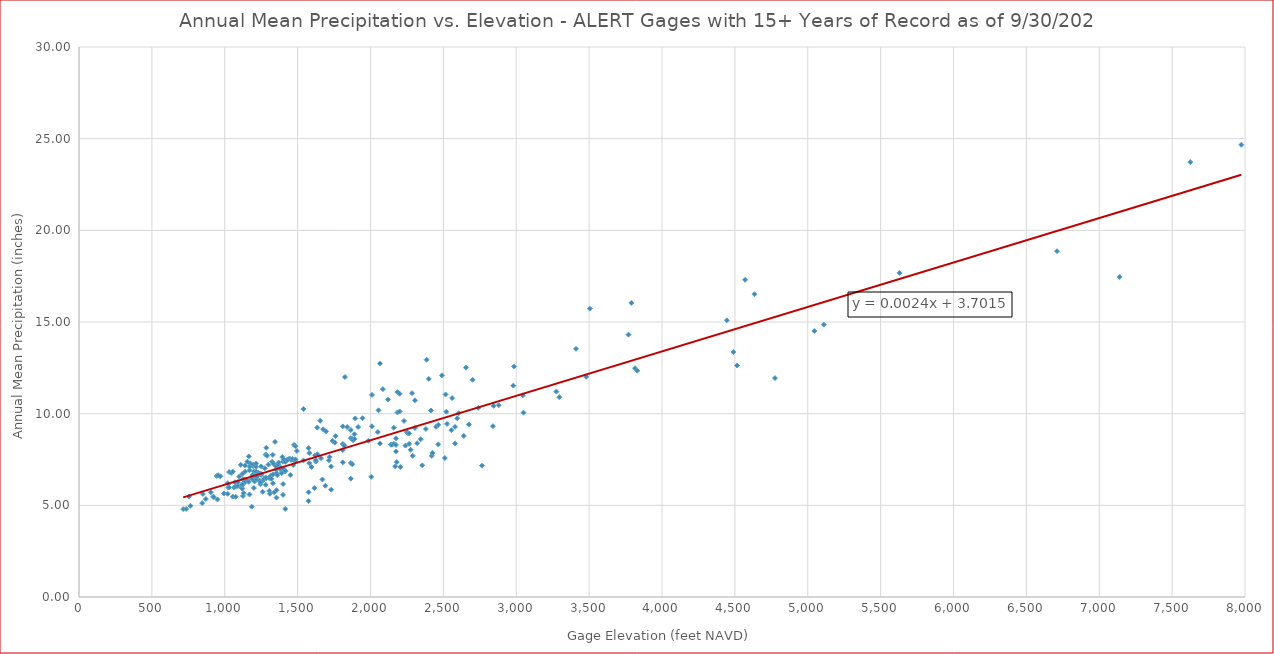
| Category | Series 0 |
|---|---|
| 715.0 | 4.795 |
| 735.0 | 4.805 |
| 755.0 | 5.478 |
| 765.0 | 4.974 |
| 845.0 | 5.12 |
| 850.0 | 5.62 |
| 870.0 | 5.345 |
| 905.0 | 5.713 |
| 920.0 | 5.465 |
| 925.0 | 5.451 |
| 945.0 | 6.602 |
| 950.0 | 5.32 |
| 955.0 | 6.643 |
| 970.0 | 6.581 |
| 995.0 | 5.648 |
| 1020.0 | 5.63 |
| 1020.0 | 6.209 |
| 1025.0 | 5.972 |
| 1025.0 | 6.163 |
| 1030.0 | 5.973 |
| 1030.0 | 6.816 |
| 1045.0 | 6.77 |
| 1055.0 | 5.474 |
| 1055.0 | 6.836 |
| 1065.0 | 5.971 |
| 1070.0 | 6.258 |
| 1075.0 | 5.467 |
| 1075.0 | 6.025 |
| 1090.0 | 6.056 |
| 1090.0 | 6.259 |
| 1100.0 | 6.566 |
| 1110.0 | 7.208 |
| 1115.0 | 5.955 |
| 1120.0 | 5.91 |
| 1120.0 | 6.095 |
| 1120.0 | 6.134 |
| 1120.0 | 6.71 |
| 1125.0 | 5.51 |
| 1125.0 | 6.402 |
| 1130.0 | 5.663 |
| 1130.0 | 6.416 |
| 1140.0 | 6.27 |
| 1140.0 | 6.839 |
| 1140.0 | 7.17 |
| 1150.0 | 6.401 |
| 1155.0 | 7.38 |
| 1165.0 | 6.279 |
| 1165.0 | 7.669 |
| 1170.0 | 5.592 |
| 1170.0 | 6.909 |
| 1170.0 | 7.117 |
| 1175.0 | 7.29 |
| 1185.0 | 4.925 |
| 1185.0 | 6.487 |
| 1190.0 | 6.422 |
| 1190.0 | 6.647 |
| 1195.0 | 7.14 |
| 1195.0 | 7.219 |
| 1200.0 | 5.945 |
| 1200.0 | 6.851 |
| 1205.0 | 6.303 |
| 1210.0 | 6.503 |
| 1210.0 | 7.173 |
| 1215.0 | 6.416 |
| 1215.0 | 6.43 |
| 1215.0 | 6.578 |
| 1215.0 | 6.727 |
| 1215.0 | 6.777 |
| 1215.0 | 6.835 |
| 1215.0 | 7.102 |
| 1215.0 | 7.279 |
| 1220.0 | 6.569 |
| 1230.0 | 6.775 |
| 1240.0 | 6.306 |
| 1240.0 | 6.344 |
| 1240.0 | 6.734 |
| 1245.0 | 6.149 |
| 1245.0 | 6.27 |
| 1250.0 | 6.658 |
| 1250.0 | 6.724 |
| 1250.0 | 7.123 |
| 1260.0 | 5.741 |
| 1265.0 | 6.372 |
| 1270.0 | 6.452 |
| 1275.0 | 7.025 |
| 1280.0 | 6.126 |
| 1280.0 | 6.514 |
| 1280.0 | 7.77 |
| 1285.0 | 6.491 |
| 1285.0 | 7.747 |
| 1285.0 | 8.142 |
| 1290.0 | 7.704 |
| 1300.0 | 7.222 |
| 1305.0 | 5.785 |
| 1305.0 | 6.485 |
| 1310.0 | 5.631 |
| 1315.0 | 6.618 |
| 1320.0 | 6.454 |
| 1325.0 | 7.373 |
| 1330.0 | 6.202 |
| 1330.0 | 6.684 |
| 1330.0 | 7.753 |
| 1335.0 | 7.267 |
| 1340.0 | 5.708 |
| 1345.0 | 8.462 |
| 1350.0 | 6.955 |
| 1350.0 | 7.145 |
| 1355.0 | 5.421 |
| 1355.0 | 5.826 |
| 1355.0 | 6.754 |
| 1360.0 | 6.651 |
| 1365.0 | 7.233 |
| 1370.0 | 7.334 |
| 1375.0 | 7.046 |
| 1385.0 | 6.932 |
| 1385.0 | 7.052 |
| 1390.0 | 6.753 |
| 1390.0 | 6.957 |
| 1395.0 | 7.636 |
| 1400.0 | 5.569 |
| 1400.0 | 6.164 |
| 1400.0 | 7.381 |
| 1405.0 | 6.987 |
| 1405.0 | 7.501 |
| 1415.0 | 4.804 |
| 1415.0 | 6.845 |
| 1415.0 | 6.882 |
| 1415.0 | 7.365 |
| 1430.0 | 7.459 |
| 1430.0 | 7.498 |
| 1445.0 | 7.557 |
| 1450.0 | 6.651 |
| 1455.0 | 7.475 |
| 1465.0 | 7.531 |
| 1470.0 | 7.199 |
| 1475.0 | 8.294 |
| 1485.0 | 7.403 |
| 1485.0 | 7.51 |
| 1485.0 | 8.229 |
| 1495.0 | 7.966 |
| 1540.0 | 7.447 |
| 1540.0 | 10.25 |
| 1575.0 | 5.231 |
| 1575.0 | 5.714 |
| 1575.0 | 8.122 |
| 1580.0 | 7.3 |
| 1580.0 | 7.853 |
| 1595.0 | 7.093 |
| 1615.0 | 5.94 |
| 1620.0 | 7.726 |
| 1625.0 | 7.384 |
| 1625.0 | 7.468 |
| 1635.0 | 7.785 |
| 1635.0 | 9.239 |
| 1655.0 | 9.612 |
| 1660.0 | 7.573 |
| 1670.0 | 6.411 |
| 1675.0 | 9.149 |
| 1690.0 | 6.066 |
| 1695.0 | 9.037 |
| 1715.0 | 7.459 |
| 1720.0 | 7.635 |
| 1730.0 | 5.852 |
| 1730.0 | 7.121 |
| 1740.0 | 8.516 |
| 1755.0 | 8.423 |
| 1760.0 | 8.773 |
| 1810.0 | 7.343 |
| 1810.0 | 8.013 |
| 1810.0 | 8.348 |
| 1810.0 | 9.305 |
| 1820.0 | 8.271 |
| 1825.0 | 12 |
| 1840.0 | 9.271 |
| 1865.0 | 6.454 |
| 1865.0 | 7.307 |
| 1865.0 | 8.666 |
| 1865.0 | 9.109 |
| 1875.0 | 7.242 |
| 1875.0 | 8.629 |
| 1880.0 | 8.551 |
| 1890.0 | 8.625 |
| 1890.0 | 8.876 |
| 1895.0 | 9.739 |
| 1915.0 | 9.272 |
| 1945.0 | 9.751 |
| 1985.0 | 8.519 |
| 2005.0 | 6.556 |
| 2010.0 | 9.313 |
| 2010.0 | 11.023 |
| 2050.0 | 8.998 |
| 2055.0 | 10.185 |
| 2065.0 | 8.372 |
| 2065.0 | 12.737 |
| 2085.0 | 11.338 |
| 2120.0 | 10.766 |
| 2140.0 | 8.309 |
| 2145.0 | 8.308 |
| 2160.0 | 8.351 |
| 2160.0 | 9.231 |
| 2170.0 | 7.124 |
| 2175.0 | 7.941 |
| 2175.0 | 8.295 |
| 2175.0 | 8.656 |
| 2180.0 | 7.36 |
| 2185.0 | 10.069 |
| 2185.0 | 11.174 |
| 2200.0 | 10.123 |
| 2200.0 | 11.087 |
| 2205.0 | 7.087 |
| 2230.0 | 9.601 |
| 2240.0 | 8.26 |
| 2250.0 | 8.999 |
| 2255.0 | 8.944 |
| 2265.0 | 8.352 |
| 2265.0 | 8.918 |
| 2275.0 | 8.03 |
| 2285.0 | 11.119 |
| 2290.0 | 7.703 |
| 2305.0 | 9.22 |
| 2305.0 | 10.728 |
| 2320.0 | 8.389 |
| 2345.0 | 8.607 |
| 2355.0 | 7.184 |
| 2380.0 | 9.164 |
| 2385.0 | 12.943 |
| 2400.0 | 11.896 |
| 2415.0 | 10.176 |
| 2420.0 | 7.698 |
| 2425.0 | 7.858 |
| 2450.0 | 9.283 |
| 2465.0 | 8.324 |
| 2465.0 | 9.391 |
| 2490.0 | 12.09 |
| 2510.0 | 7.578 |
| 2515.0 | 11.048 |
| 2520.0 | 10.102 |
| 2525.0 | 9.439 |
| 2555.0 | 9.101 |
| 2560.0 | 10.848 |
| 2580.0 | 8.379 |
| 2580.0 | 9.279 |
| 2595.0 | 9.746 |
| 2605.0 | 10.023 |
| 2640.0 | 8.785 |
| 2655.0 | 12.51 |
| 2675.0 | 9.405 |
| 2700.0 | 11.85 |
| 2740.0 | 10.315 |
| 2765.0 | 7.166 |
| 2840.0 | 9.317 |
| 2845.0 | 10.427 |
| 2880.0 | 10.461 |
| 2980.0 | 11.53 |
| 2985.0 | 12.571 |
| 3045.0 | 11 |
| 3050.0 | 10.054 |
| 3275.0 | 11.205 |
| 3295.0 | 10.904 |
| 3410.0 | 13.536 |
| 3480.0 | 12.01 |
| 3505.0 | 15.731 |
| 3770.0 | 14.308 |
| 3790.0 | 16.044 |
| 3815.0 | 12.479 |
| 3830.0 | 12.343 |
| 4445.0 | 15.093 |
| 4490.0 | 13.36 |
| 4515.0 | 12.626 |
| 4570.0 | 17.301 |
| 4635.0 | 16.518 |
| 4775.0 | 11.942 |
| 5045.0 | 14.508 |
| 5110.0 | 14.857 |
| 5630.0 | 17.678 |
| 6710.0 | 18.861 |
| 7140.0 | 17.458 |
| 7625.0 | 23.721 |
| 7975.0 | 24.67 |